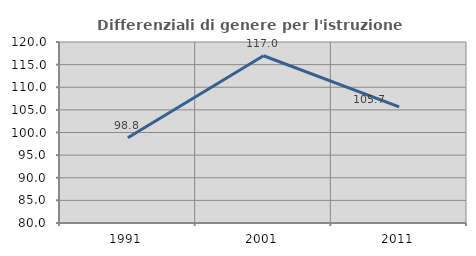
| Category | Differenziali di genere per l'istruzione superiore |
|---|---|
| 1991.0 | 98.838 |
| 2001.0 | 116.957 |
| 2011.0 | 105.671 |